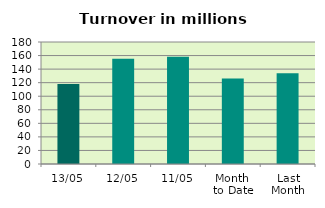
| Category | Series 0 |
|---|---|
| 13/05 | 118.068 |
| 12/05 | 155.278 |
| 11/05 | 158.336 |
| Month 
to Date | 126.149 |
| Last
Month | 133.981 |